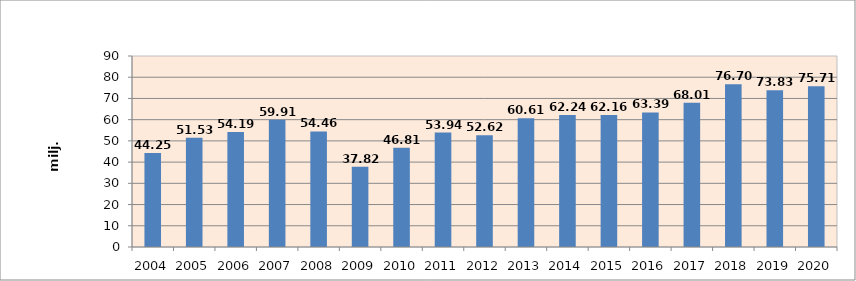
| Category | Series 0 |
|---|---|
| 2004.0 | 44.25 |
| 2005.0 | 51.53 |
| 2006.0 | 54.19 |
| 2007.0 | 59.91 |
| 2008.0 | 54.46 |
| 2009.0 | 37.82 |
| 2010.0 | 46.81 |
| 2011.0 | 53.94 |
| 2012.0 | 52.62 |
| 2013.0 | 60.61 |
| 2014.0 | 62.24 |
| 2015.0 | 62.16 |
| 2016.0 | 63.388 |
| 2017.0 | 68.01 |
| 2018.0 | 76.7 |
| 2019.0 | 73.83 |
| 2020.0 | 75.71 |